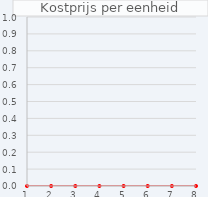
| Category | Simulatie - Jaarmutaties |
|---|---|
| 1.0 | 0 |
| 2.0 | 0 |
| 3.0 | 0 |
| 4.0 | 0 |
| 5.0 | 0 |
| 6.0 | 0 |
| 7.0 | 0 |
| 8.0 | 0 |